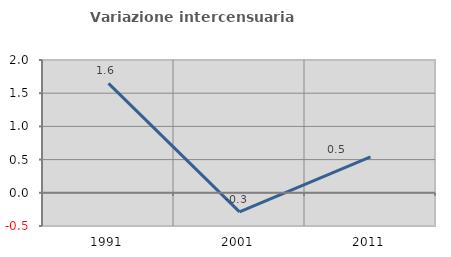
| Category | Variazione intercensuaria annua |
|---|---|
| 1991.0 | 1.649 |
| 2001.0 | -0.287 |
| 2011.0 | 0.541 |